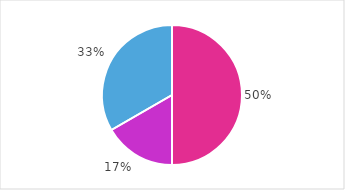
| Category | Series 0 |
|---|---|
| Stefan Selinger | 150 |
| Stefan Selinger | 50 |
| Stefan Selinger | 100 |